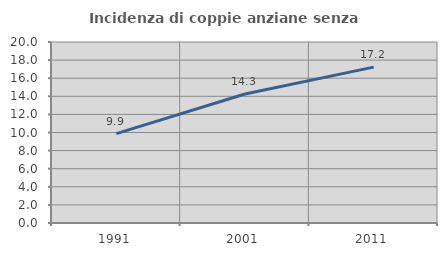
| Category | Incidenza di coppie anziane senza figli  |
|---|---|
| 1991.0 | 9.878 |
| 2001.0 | 14.253 |
| 2011.0 | 17.222 |